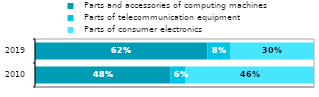
| Category |   Parts and accessories of computing machines |   Parts of telecommunication equipment |   Parts of consumer electronics |
|---|---|---|---|
| 2010 | 0.485 | 0.055 | 0.46 |
| 2019 | 0.618 | 0.081 | 0.301 |